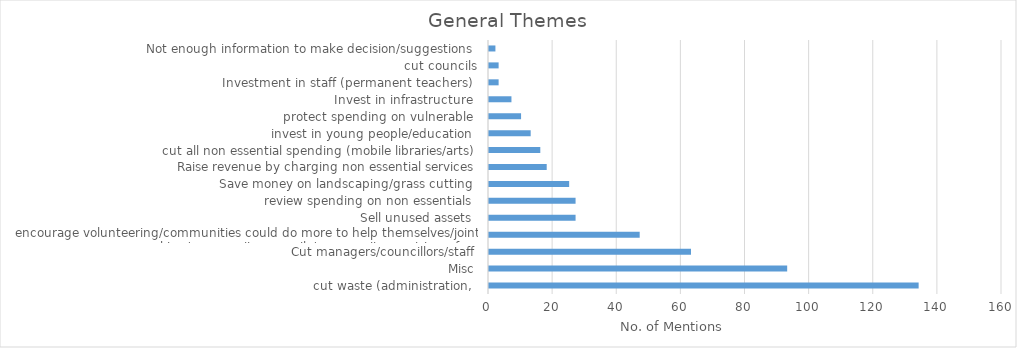
| Category | Series 0 |
|---|---|
| cut waste (administration,  | 134 |
| Misc | 93 |
| Cut managers/councillors/staff | 63 |
| encourage volunteering/communities could do more to help themselves/joint working/community councils/community asset transfers  | 47 |
| Sell unused assets  | 27 |
| review spending on non essentials  | 27 |
| Save money on landscaping/grass cutting  | 25 |
| Raise revenue by charging non essential services | 18 |
| cut all non essential spending (mobile libraries/arts) | 16 |
| invest in young people/education  | 13 |
| protect spending on vulnerable  | 10 |
| Invest in infrastructure  | 7 |
| Investment in staff (permanent teachers)  | 3 |
| cut councils | 3 |
| Not enough information to make decision/suggestions  | 2 |